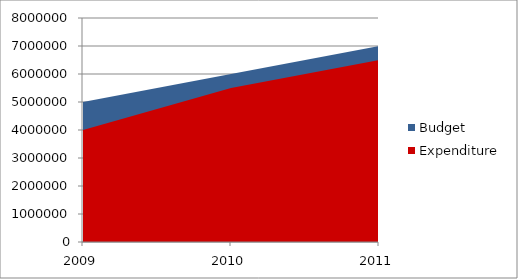
| Category | Budget | Expenditure |
|---|---|---|
| 2009.0 | 5000000 | 4000000 |
| 2010.0 | 6000000 | 5500000 |
| 2011.0 | 7000000 | 6500000 |